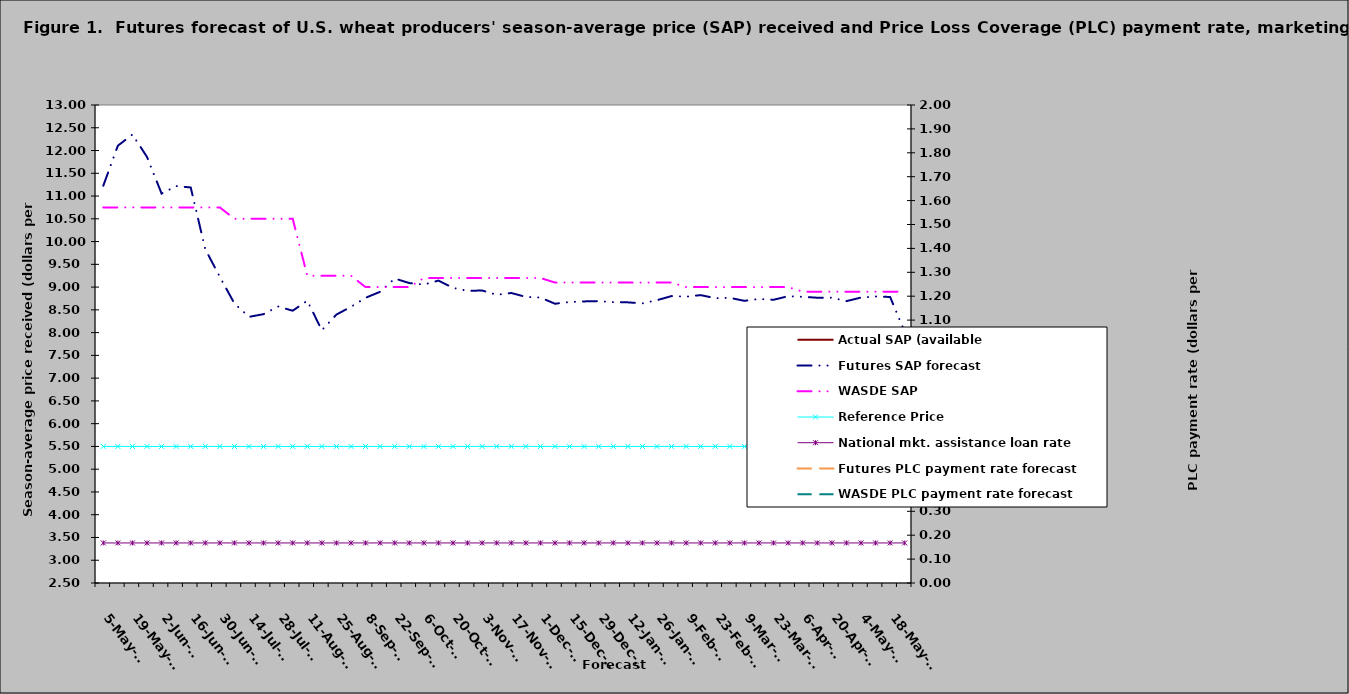
| Category | Actual SAP (available | Futures SAP forecast | WASDE SAP | Reference Price | National mkt. assistance loan rate |
|---|---|---|---|---|---|
| 2022-05-05 |  | 11.227 | 10.75 | 5.5 | 3.38 |
| 2022-05-12 |  | 12.105 | 10.75 | 5.5 | 3.38 |
| 2022-05-19 |  | 12.352 | 10.75 | 5.5 | 3.38 |
| 2022-05-26 |  | 11.86 | 10.75 | 5.5 | 3.38 |
| 2022-06-02 |  | 11.055 | 10.75 | 5.5 | 3.38 |
| 2022-06-09 |  | 11.219 | 10.75 | 5.5 | 3.38 |
| 2022-06-16 |  | 11.188 | 10.75 | 5.5 | 3.38 |
| 2022-06-23 |  | 9.83 | 10.75 | 5.5 | 3.38 |
| 2022-06-30 |  | 9.224 | 10.75 | 5.5 | 3.38 |
| 2022-07-07 |  | 8.64 | 10.5 | 5.5 | 3.38 |
| 2022-07-14 |  | 8.346 | 10.5 | 5.5 | 3.38 |
| 2022-07-21 |  | 8.406 | 10.5 | 5.5 | 3.38 |
| 2022-07-28 |  | 8.573 | 10.5 | 5.5 | 3.38 |
| 2022-08-04 |  | 8.482 | 10.5 | 5.5 | 3.38 |
| 2022-08-11 |  | 8.701 | 9.25 | 5.5 | 3.38 |
| 2022-08-18 |  | 8.051 | 9.25 | 5.5 | 3.38 |
| 2022-08-25 |  | 8.397 | 9.25 | 5.5 | 3.38 |
| 2022-09-01 |  | 8.567 | 9.25 | 5.5 | 3.38 |
| 2022-09-08 |  | 8.765 | 9 | 5.5 | 3.38 |
| 2022-09-15 |  | 8.897 | 9 | 5.5 | 3.38 |
| 2022-09-22 |  | 9.189 | 9 | 5.5 | 3.38 |
| 2022-09-29 |  | 9.089 | 9 | 5.5 | 3.38 |
| 2022-10-06 |  | 9.055 | 9.2 | 5.5 | 3.38 |
| 2022-10-13 |  | 9.143 | 9.2 | 5.5 | 3.38 |
| 2022-10-20 |  | 8.983 | 9.2 | 5.5 | 3.38 |
| 2022-10-27 |  | 8.918 | 9.2 | 5.5 | 3.38 |
| 2022-11-03 |  | 8.925 | 9.2 | 5.5 | 3.38 |
| 2022-11-10 |  | 8.83 | 9.2 | 5.5 | 3.38 |
| 2022-11-17 |  | 8.87 | 9.2 | 5.5 | 3.38 |
| 2022-11-24 |  | 8.785 | 9.2 | 5.5 | 3.38 |
| 2022-12-01 |  | 8.77 | 9.2 | 5.5 | 3.38 |
| 2022-12-08 |  | 8.635 | 9.1 | 5.5 | 3.38 |
| 2022-12-15 |  | 8.672 | 9.1 | 5.5 | 3.38 |
| 2022-12-22 |  | 8.686 | 9.1 | 5.5 | 3.38 |
| 2022-12-29 |  | 8.692 | 9.1 | 5.5 | 3.38 |
| 2023-01-05 |  | 8.67 | 9.1 | 5.5 | 3.38 |
| 2023-01-12 |  | 8.665 | 9.1 | 5.5 | 3.38 |
| 2023-01-19 |  | 8.642 | 9.1 | 5.5 | 3.38 |
| 2023-01-26 |  | 8.712 | 9.1 | 5.5 | 3.38 |
| 2023-02-02 |  | 8.803 | 9.1 | 5.5 | 3.38 |
| 2023-02-09 |  | 8.79 | 9 | 5.5 | 3.38 |
| 2023-02-16 |  | 8.824 | 9 | 5.5 | 3.38 |
| 2023-02-23 |  | 8.756 | 9 | 5.5 | 3.38 |
| 2023-03-02 |  | 8.764 | 9 | 5.5 | 3.38 |
| 2023-03-09 |  | 8.698 | 9 | 5.5 | 3.38 |
| 2023-03-16 |  | 8.739 | 9 | 5.5 | 3.38 |
| 2023-03-23 |  | 8.722 | 9 | 5.5 | 3.38 |
| 2023-03-30 |  | 8.799 | 9 | 5.5 | 3.38 |
| 2023-04-06 |  | 8.786 | 8.9 | 5.5 | 3.38 |
| 2023-04-13 |  | 8.767 | 8.9 | 5.5 | 3.38 |
| 2023-04-20 |  | 8.768 | 8.9 | 5.5 | 3.38 |
| 2023-04-27 |  | 8.692 | 8.9 | 5.5 | 3.38 |
| 2023-05-04 |  | 8.77 | 8.9 | 5.5 | 3.38 |
| 2023-05-11 |  | 8.794 | 8.9 | 5.5 | 3.38 |
| 2023-05-18 |  | 8.783 | 8.9 | 5.5 | 3.38 |
| 2023-05-25 |  | 8.012 | 8.9 | 5.5 | 3.38 |